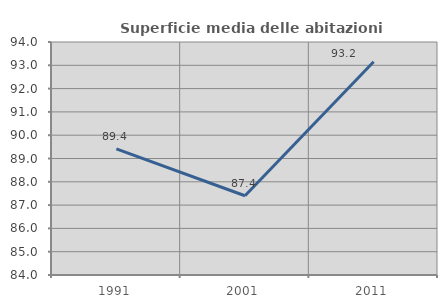
| Category | Superficie media delle abitazioni occupate |
|---|---|
| 1991.0 | 89.409 |
| 2001.0 | 87.401 |
| 2011.0 | 93.155 |